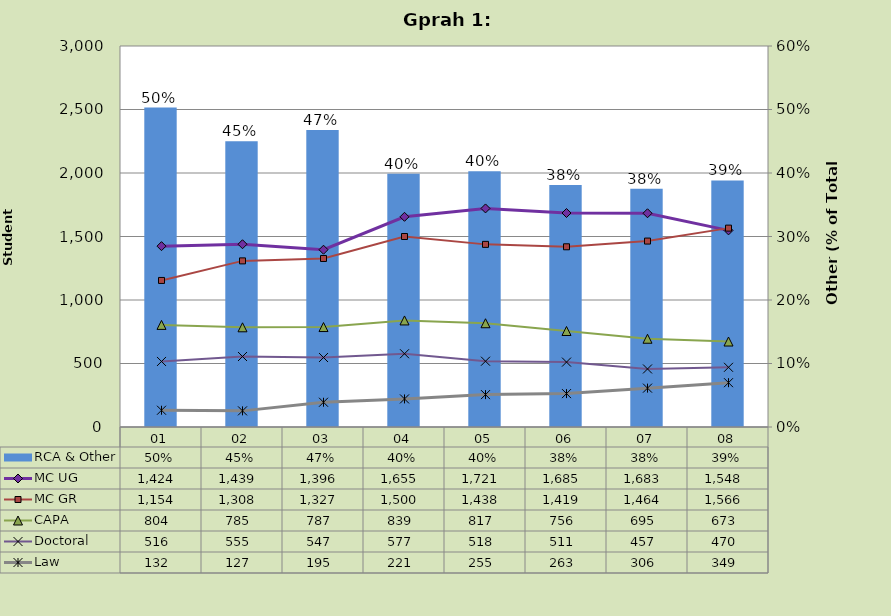
| Category | RCA & Other |
|---|---|
| 0 | 0.503 |
| 1 | 0.45 |
| 2 | 0.468 |
| 3 | 0.399 |
| 4 | 0.403 |
| 5 | 0.381 |
| 6 | 0.375 |
| 7 | 0.388 |